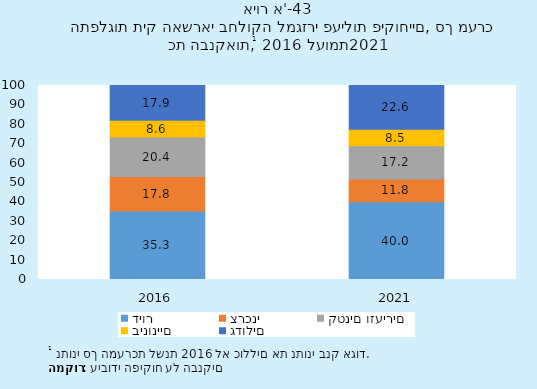
| Category | דיור | צרכני | קטנים וזעירים | בינוניים | גדולים |
|---|---|---|---|---|---|
| 2016.0 | 35.311 | 17.78 | 20.418 | 8.61 | 17.88 |
| 2021.0 | 40.016 | 11.753 | 17.164 | 8.509 | 22.557 |